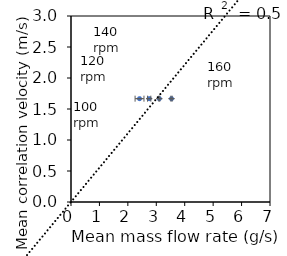
| Category | Series 0 |
|---|---|
| 2.4104666666666668 | 1.667 |
| 2.7510333333333334 | 1.667 |
| 3.106333333333333 | 1.667 |
| 3.5353666666666665 | 1.667 |